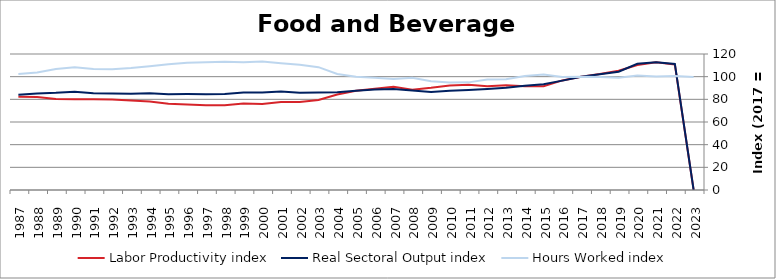
| Category | Labor Productivity index | Real Sectoral Output index | Hours Worked index |
|---|---|---|---|
| 2023.0 | 0 | 0 | 99.661 |
| 2022.0 | 110.639 | 111.232 | 100.536 |
| 2021.0 | 112.627 | 112.707 | 100.071 |
| 2020.0 | 110.265 | 111.345 | 100.98 |
| 2019.0 | 105.297 | 104.38 | 99.129 |
| 2018.0 | 102.442 | 102.044 | 99.612 |
| 2017.0 | 100 | 100 | 100 |
| 2016.0 | 96.7 | 96.519 | 99.812 |
| 2015.0 | 91.486 | 93.221 | 101.896 |
| 2014.0 | 91.459 | 92.037 | 100.632 |
| 2013.0 | 92.357 | 90.233 | 97.7 |
| 2012.0 | 91.45 | 89.077 | 97.406 |
| 2011.0 | 92.947 | 88.273 | 94.971 |
| 2010.0 | 92.263 | 87.505 | 94.843 |
| 2009.0 | 90.134 | 86.412 | 95.871 |
| 2008.0 | 88.504 | 87.692 | 99.082 |
| 2007.0 | 90.994 | 89.109 | 97.929 |
| 2006.0 | 89.434 | 88.599 | 99.067 |
| 2005.0 | 87.636 | 87.562 | 99.916 |
| 2004.0 | 84.287 | 86.292 | 102.379 |
| 2003.0 | 79.362 | 86.014 | 108.383 |
| 2002.0 | 77.656 | 85.787 | 110.471 |
| 2001.0 | 77.675 | 86.85 | 111.812 |
| 2000.0 | 75.914 | 86.042 | 113.342 |
| 1999.0 | 76.27 | 86.009 | 112.77 |
| 1998.0 | 74.78 | 84.605 | 113.139 |
| 1997.0 | 74.834 | 84.433 | 112.826 |
| 1996.0 | 75.423 | 84.635 | 112.215 |
| 1995.0 | 76.183 | 84.507 | 110.926 |
| 1994.0 | 78.124 | 85.345 | 109.243 |
| 1993.0 | 78.883 | 84.928 | 107.663 |
| 1992.0 | 79.945 | 85.175 | 106.541 |
| 1991.0 | 79.971 | 85.413 | 106.806 |
| 1990.0 | 80.079 | 86.767 | 108.352 |
| 1989.0 | 80.335 | 85.719 | 106.701 |
| 1988.0 | 82.068 | 85.167 | 103.777 |
| 1987.0 | 82.207 | 84.088 | 102.288 |